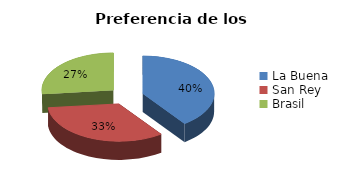
| Category | Participación de mercado |
|---|---|
| La Buena  | 0.4 |
| San Rey | 0.333 |
| Brasil | 0.267 |